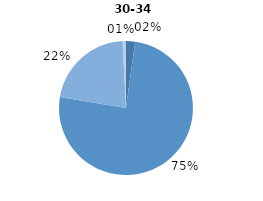
| Category | Series 0 |
|---|---|
| 0 | 2.189 |
| 1 | 75.458 |
| 2 | 21.535 |
| 3 | 0.819 |